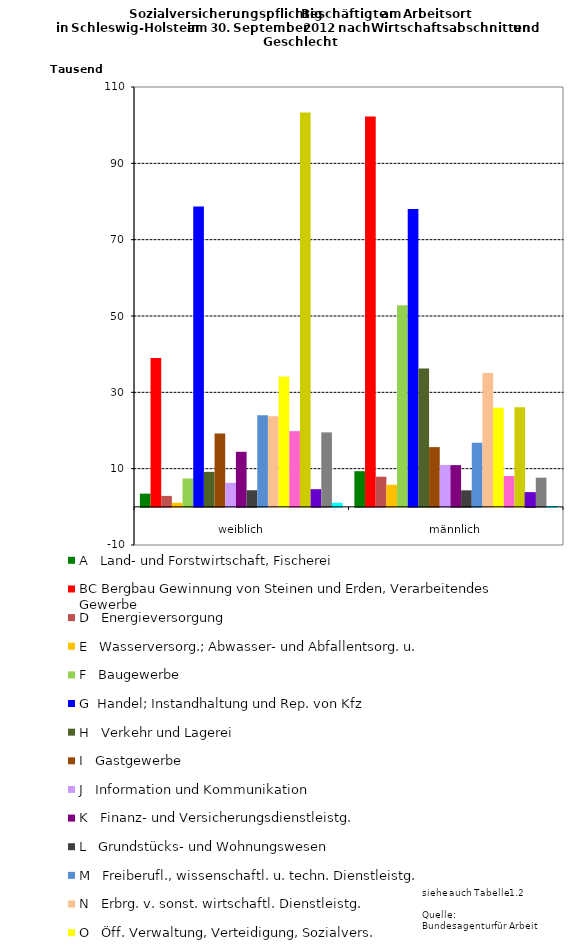
| Category | A   Land- und Forstwirtschaft, Fischerei | BC Bergbau Gewinnung von Steinen und Erden, Verarbeitendes Gewerbe | D   Energieversorgung | E   Wasserversorg.; Abwasser- und Abfallentsorg. u. | F   Baugewerbe | G  Handel; Instandhaltung und Rep. von Kfz | H   Verkehr und Lagerei | I   Gastgewerbe | J   Information und Kommunikation | K   Finanz- und Versicherungsdienstleistg. | L   Grundstücks- und Wohnungswesen | M   Freiberufl., wissenschaftl. u. techn. Dienstleistg. | N   Erbrg. v. sonst. wirtschaftl. Dienstleistg. | O   Öff. Verwaltung, Verteidigung, Sozialvers. | P   Erziehung und Unterricht | Q   Gesundheits- und Sozialwesen | R   Kunst, Unterhaltung und Erholung | S   Erbrg. v. sonstigen Dienstleistungen | TU Private Haushalte; Exterritoriale Organisationen |
|---|---|---|---|---|---|---|---|---|---|---|---|---|---|---|---|---|---|---|---|
| weiblich | 3462 | 38978 | 2865 | 1067 | 7420 | 78713 | 9163 | 19219 | 6280 | 14419 | 4348 | 24001 | 23710 | 34156 | 19826 | 103350 | 4626 | 19508 | 1057 |
| männlich | 9341 | 102258 | 7897 | 5810 | 52823 | 78064 | 36223 | 15638 | 10971 | 10929 | 4325 | 16787 | 35033 | 25936 | 8091 | 26081 | 3714 | 7644 | 200 |